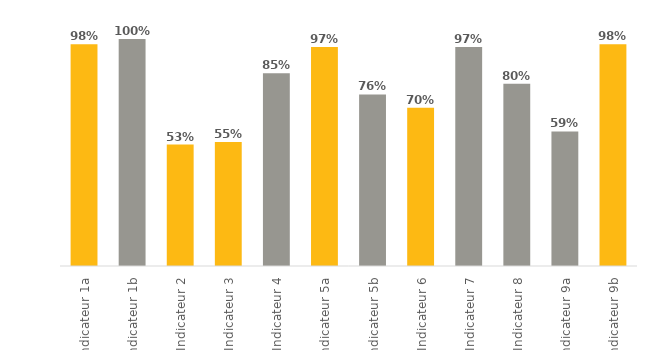
| Category | Series 0 |
|---|---|
| Indicateur 1a | 0.977 |
| Indicateur 1b | 1 |
| Indicateur 2 | 0.535 |
| Indicateur 3 | 0.547 |
| Indicateur 4 | 0.849 |
| Indicateur 5a | 0.965 |
| Indicateur 5b | 0.756 |
| Indicateur 6 | 0.698 |
| Indicateur 7 | 0.965 |
| Indicateur 8 | 0.802 |
| Indicateur 9a | 0.593 |
| Indicateur 9b | 0.977 |